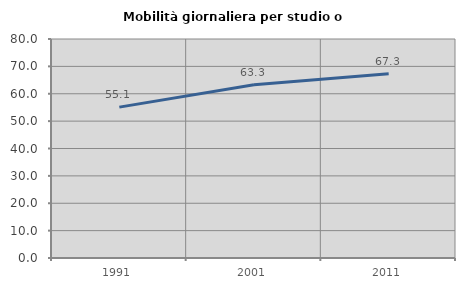
| Category | Mobilità giornaliera per studio o lavoro |
|---|---|
| 1991.0 | 55.113 |
| 2001.0 | 63.321 |
| 2011.0 | 67.263 |